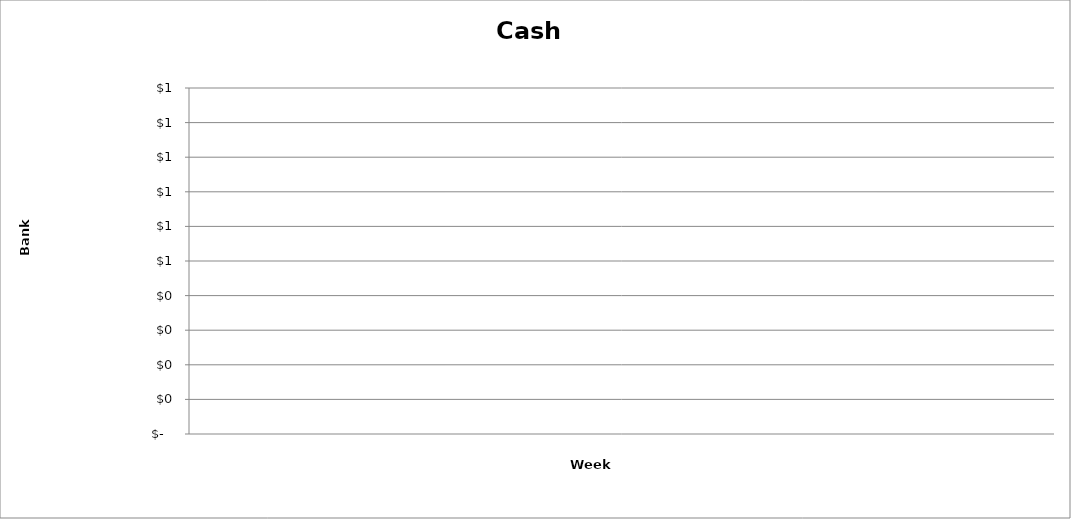
| Category | Available Cash |
|---|---|
| 2020-03-23 | 0 |
| 2020-03-30 | 0 |
| 2020-04-06 | 0 |
| 2020-04-13 | 0 |
| 2020-04-20 | 0 |
| 2020-04-27 | 0 |
| 2020-05-04 | 0 |
| 2020-05-11 | 0 |
| 2020-05-18 | 0 |
| 2020-05-25 | 0 |
| 2020-06-01 | 0 |
| 2020-06-08 | 0 |
| 2020-06-15 | 0 |